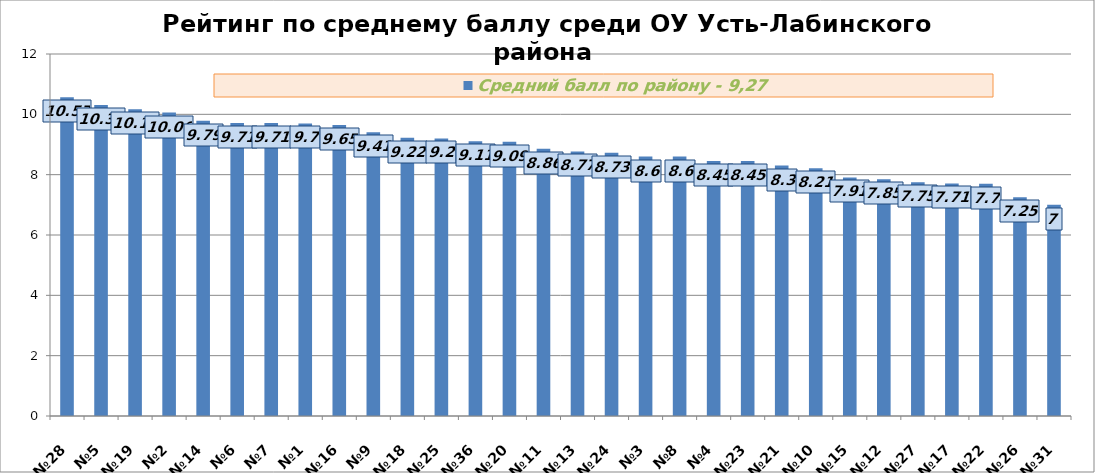
| Category | Средний балл по району - 9,27 |
|---|---|
| №28 | 10.57 |
| №5 | 10.31 |
| №19 | 10.17 |
| №2 | 10.06 |
| №14 | 9.79 |
| №6 | 9.71 |
| №7 | 9.71 |
| №1 | 9.7 |
| №16 | 9.65 |
| №9 | 9.41 |
| №18 | 9.22 |
| №25 | 9.2 |
| №36 | 9.11 |
| №20 | 9.09 |
| №11 | 8.86 |
| №13 | 8.77 |
| №24 | 8.73 |
| №3 | 8.6 |
| №8 | 8.6 |
| №4 | 8.45 |
| №23 | 8.45 |
| №21 | 8.3 |
| №10 | 8.21 |
| №15 | 7.91 |
| №12 | 7.85 |
| №27 | 7.75 |
| №17 | 7.71 |
| №22 | 7.7 |
| №26 | 7.25 |
| №31 | 7 |